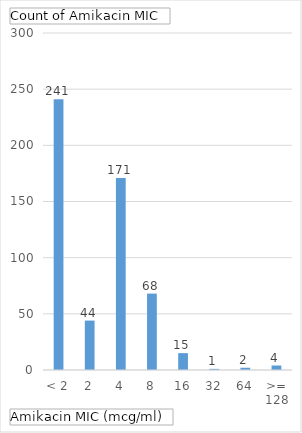
| Category | Total |
|---|---|
| < 2 | 241 |
| 2 | 44 |
| 4 | 171 |
| 8 | 68 |
| 16 | 15 |
| 32 | 1 |
| 64 | 2 |
| >= 128 | 4 |